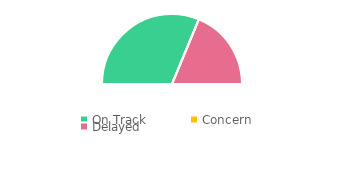
| Category | Series 0 |
|---|---|
| On Track | 5 |
| Concern | 0 |
| Delayed | 3 |
| Total Tasks | 8 |